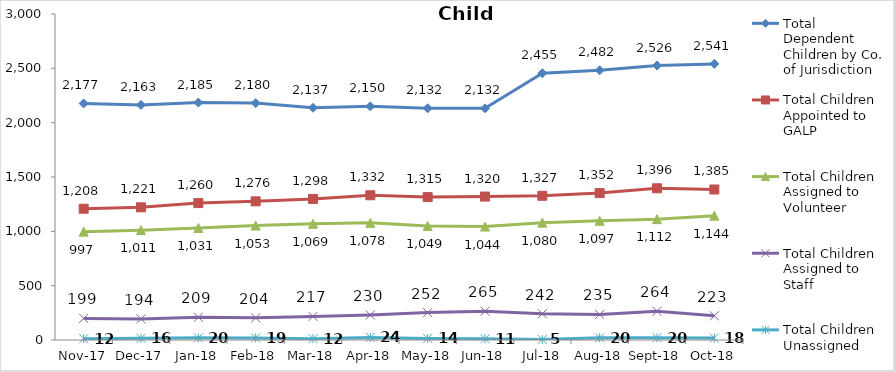
| Category | Total Dependent Children by Co. of Jurisdiction | Total Children Appointed to GALP | Total Children Assigned to Volunteer | Total Children Assigned to Staff | Total Children Unassigned |
|---|---|---|---|---|---|
| 2017-11-01 | 2177 | 1208 | 997 | 199 | 12 |
| 2017-12-01 | 2163 | 1221 | 1011 | 194 | 16 |
| 2018-01-01 | 2185 | 1260 | 1031 | 209 | 20 |
| 2018-02-01 | 2180 | 1276 | 1053 | 204 | 19 |
| 2018-03-01 | 2137 | 1298 | 1069 | 217 | 12 |
| 2018-04-01 | 2150 | 1332 | 1078 | 230 | 24 |
| 2018-05-01 | 2132 | 1315 | 1049 | 252 | 14 |
| 2018-06-01 | 2132 | 1320 | 1044 | 265 | 11 |
| 2018-07-01 | 2455 | 1327 | 1080 | 242 | 5 |
| 2018-08-01 | 2482 | 1352 | 1097 | 235 | 20 |
| 2018-09-01 | 2526 | 1396 | 1112 | 264 | 20 |
| 2018-10-01 | 2541 | 1385 | 1144 | 223 | 18 |